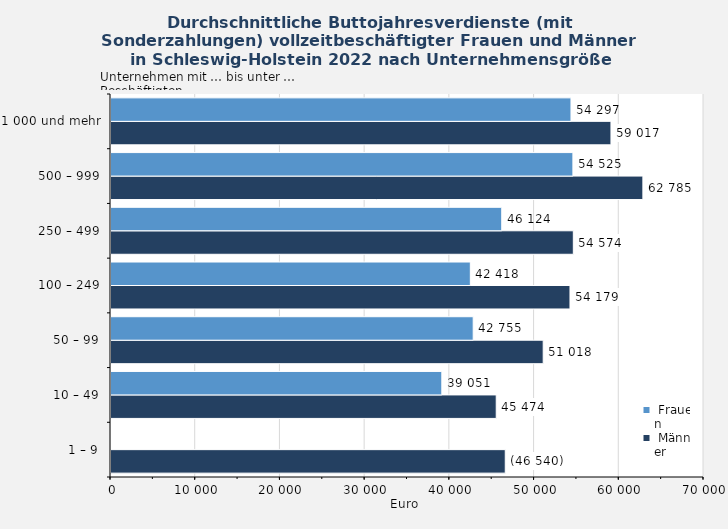
| Category |  Männer |  Frauen |
|---|---|---|
| 1 – 9 | 46540 | 0 |
| 10 – 49 | 45474 | 39051 |
| 50 – 99 | 51018 | 42755 |
| 100 – 249 | 54179 | 42418 |
| 250 – 499 | 54574 | 46124 |
| 500 – 999 | 62785 | 54525 |
| 1 000 und mehr | 59017 | 54297 |